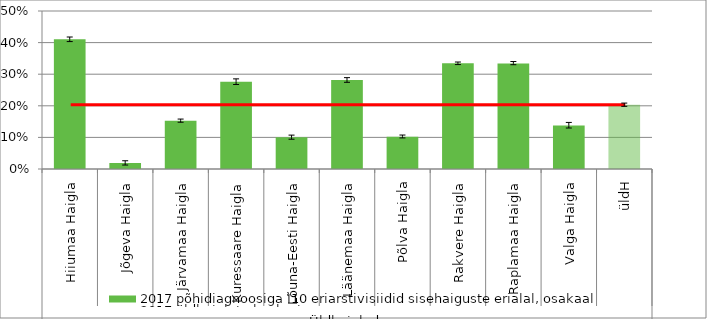
| Category | 2017 põhidiagnoosiga I10 eriarstivisiidid sisehaiguste erialal, osakaal |
|---|---|
| 0 | 0.41 |
| 1 | 0.019 |
| 2 | 0.153 |
| 3 | 0.276 |
| 4 | 0.101 |
| 5 | 0.281 |
| 6 | 0.102 |
| 7 | 0.334 |
| 8 | 0.334 |
| 9 | 0.138 |
| 10 | 0.203 |